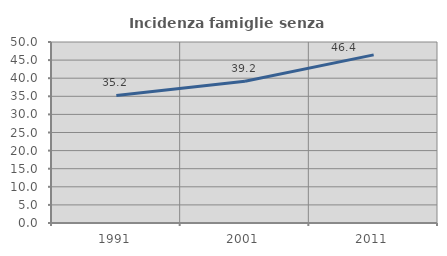
| Category | Incidenza famiglie senza nuclei |
|---|---|
| 1991.0 | 35.233 |
| 2001.0 | 39.163 |
| 2011.0 | 46.436 |